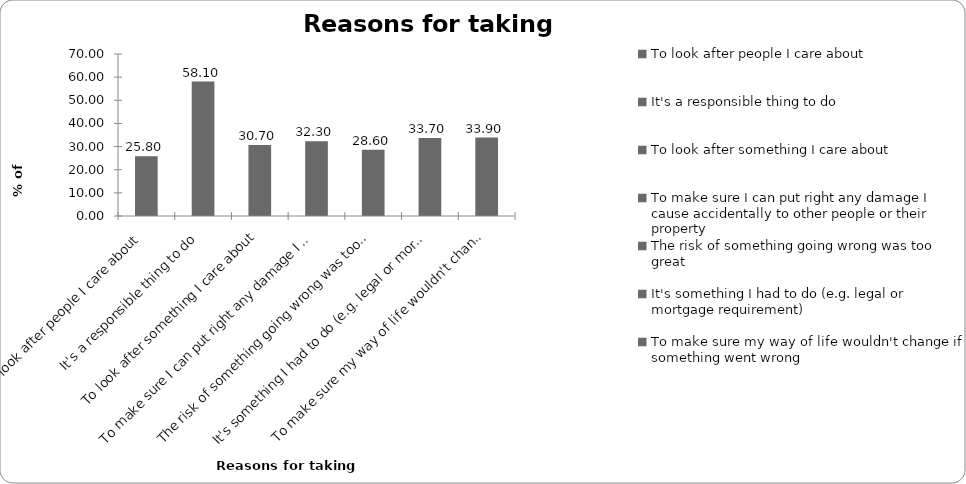
| Category | Reasons for taking insurance |
|---|---|
| To look after people I care about | 25.8 |
| It's a responsible thing to do | 58.1 |
| To look after something I care about | 30.7 |
| To make sure I can put right any damage I cause accidentally to other people or their property | 32.3 |
| The risk of something going wrong was too great | 28.6 |
| It's something I had to do (e.g. legal or mortgage requirement) | 33.7 |
| To make sure my way of life wouldn't change if something went wrong | 33.9 |